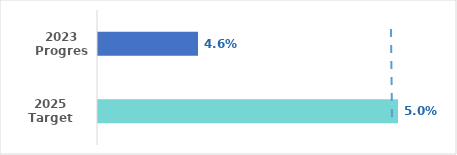
| Category | Series 0 |
|---|---|
| 2023 Progress | 0.046 |
| 2025 Target | 0.05 |